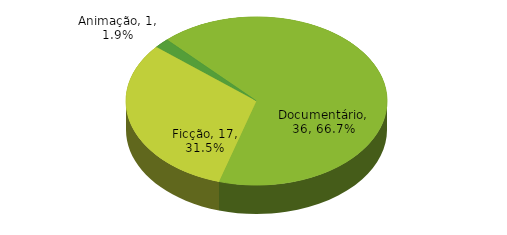
| Category | Quantidade Obras |
|---|---|
| Animação | 1 |
| Documentário | 36 |
| Ficção | 17 |